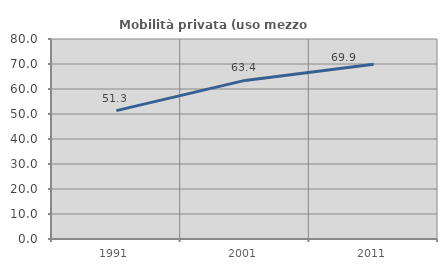
| Category | Mobilità privata (uso mezzo privato) |
|---|---|
| 1991.0 | 51.347 |
| 2001.0 | 63.443 |
| 2011.0 | 69.871 |